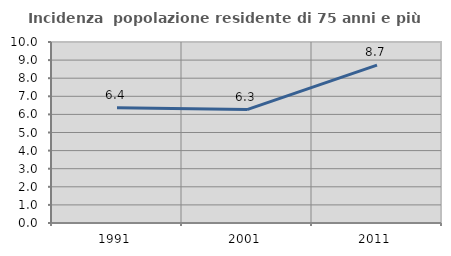
| Category | Incidenza  popolazione residente di 75 anni e più |
|---|---|
| 1991.0 | 6.363 |
| 2001.0 | 6.266 |
| 2011.0 | 8.723 |